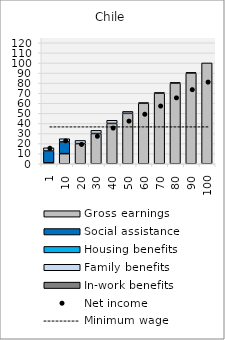
| Category | Gross earnings | Social assistance | Housing benefits | Family benefits | In-work benefits |
|---|---|---|---|---|---|
| 1.0 | 1 | 11.687 | 0 | 3.144 | 0 |
| 10.0 | 10 | 11.687 | 0 | 3.144 | 0 |
| 20.0 | 20 | 0 | 0 | 3.144 | 0 |
| 30.0 | 30 | 0 | 0 | 3.144 | 0 |
| 40.0 | 40 | 0 | 0 | 3.144 | 0 |
| 50.0 | 50 | 0 | 0 | 1.929 | 0 |
| 60.0 | 60 | 0 | 0 | 0.61 | 0 |
| 70.0 | 70 | 0 | 0 | 0.61 | 0 |
| 80.0 | 80 | 0 | 0 | 0.61 | 0 |
| 90.0 | 90 | 0 | 0 | 0.61 | 0 |
| 100.0 | 100 | 0 | 0 | 0 | 0 |